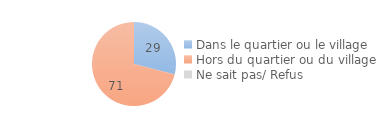
| Category | Series 0 |
|---|---|
| Dans le quartier ou le village | 29 |
| Hors du quartier ou du village | 71 |
| Ne sait pas/ Refus | 0 |